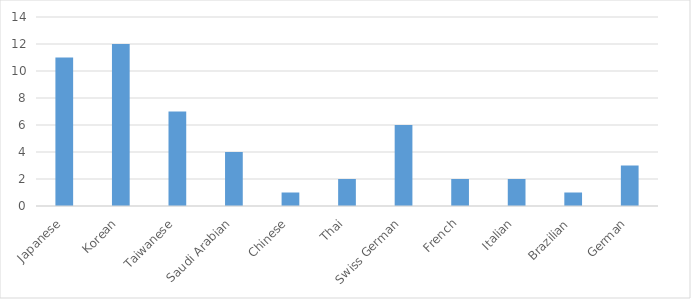
| Category | Series 0 |
|---|---|
| Japanese | 11 |
| Korean | 12 |
| Taiwanese | 7 |
| Saudi Arabian | 4 |
| Chinese | 1 |
| Thai | 2 |
| Swiss German | 6 |
| French | 2 |
| Italian | 2 |
| Brazilian | 1 |
| German | 3 |